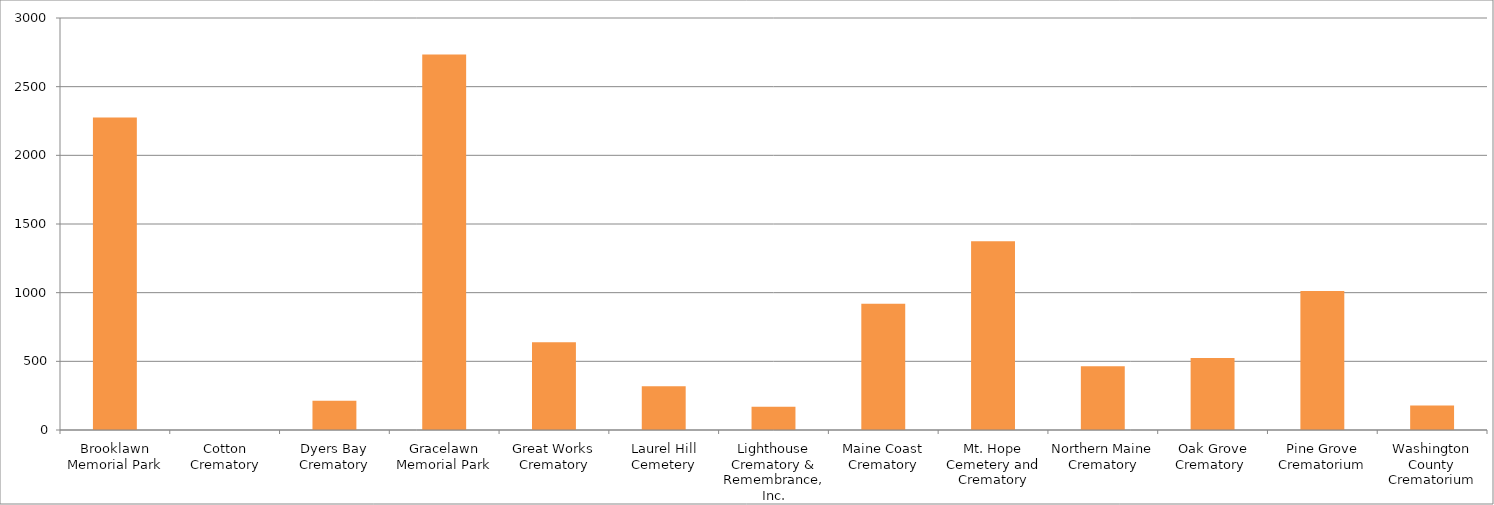
| Category | Series 0 |
|---|---|
| Brooklawn Memorial Park | 2276 |
| Cotton Crematory | 0 |
| Dyers Bay Crematory | 213 |
| Gracelawn Memorial Park | 2734 |
| Great Works Crematory | 639 |
| Laurel Hill Cemetery | 319 |
| Lighthouse Crematory & Remembrance, Inc. | 170 |
| Maine Coast Crematory | 919 |
| Mt. Hope Cemetery and Crematory | 1375 |
| Northern Maine Crematory | 464 |
| Oak Grove Crematory  | 524 |
| Pine Grove Crematorium | 1012 |
| Washington County Crematorium | 178 |